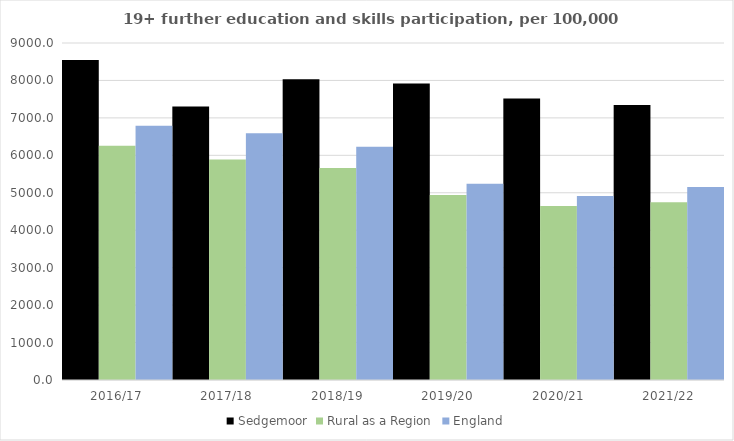
| Category | Sedgemoor | Rural as a Region | England |
|---|---|---|---|
| 2016/17 | 8549 | 6253.401 | 6788 |
| 2017/18 | 7304 | 5892.029 | 6588 |
| 2018/19 | 8032 | 5661.873 | 6227 |
| 2019/20 | 7918 | 4943.801 | 5244 |
| 2020/21 | 7521 | 4646.727 | 4913 |
| 2021/22 | 7346 | 4747.049 | 5151 |